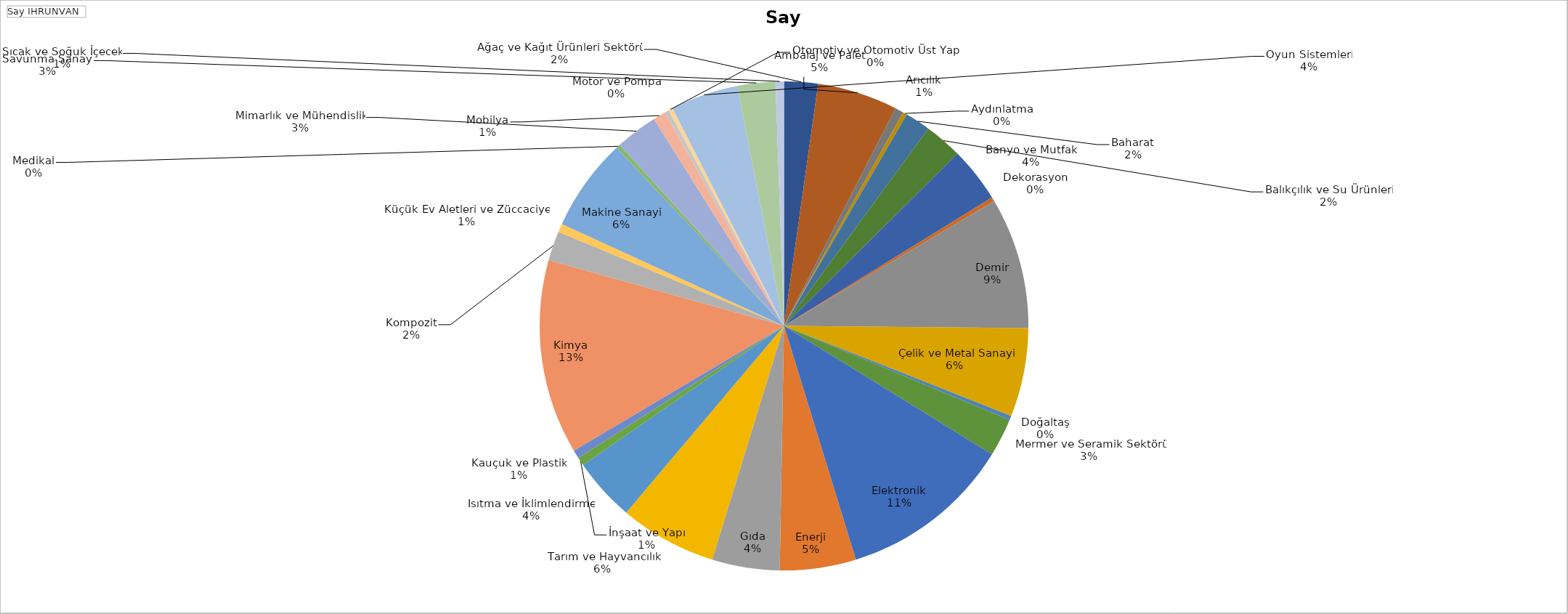
| Category | Toplam |
|---|---|
| Ağaç ve Kağıt Ürünleri Sektörü | 8 |
| Ambalaj ve Palet | 19 |
| Arıcılık | 2 |
| Aydınlatma | 1 |
| Baharat | 6 |
| Balıkçılık ve Su Ürünleri | 9 |
| Banyo ve Mutfak | 13 |
| Dekorasyon | 1 |
| Demir, Çelik ve Metal Sanayi | 31 |
| Doğaltaş, Mermer ve Seramik Sektörü | 21 |
| Elektronik | 1 |
| Enerji | 9 |
| Gıda, Tarım ve Hayvancılık | 41 |
| Isıtma ve İklimlendirme | 18 |
| İnşaat ve Yapı | 16 |
| Kauçuk ve Plastik | 23 |
| Kimya | 15 |
| Kompozit | 2 |
| Küçük Ev Aletleri ve Züccaciye | 2 |
| Makine Sanayi | 46 |
| Medikal | 7 |
| Mimarlık ve Mühendislik | 2 |
| Mobilya | 22 |
| Motor ve Pompa | 1 |
| Otomotiv ve Otomotiv Üst Yapı | 10 |
| Oyun Sistemleri | 3 |
| Savunma Sanayi | 1 |
| Sıcak ve Soğuk İçecek | 1 |
| Tekstil, Hazır Giyim, Deri | 16 |
| Tütün | 9 |
| Yat ve Tekne | 2 |